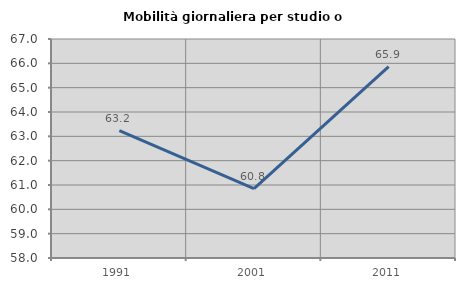
| Category | Mobilità giornaliera per studio o lavoro |
|---|---|
| 1991.0 | 63.23 |
| 2001.0 | 60.847 |
| 2011.0 | 65.865 |